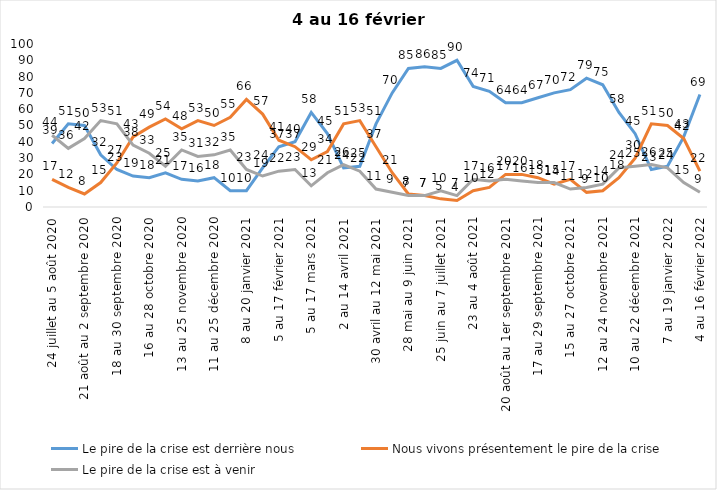
| Category | Le pire de la crise est derrière nous | Nous vivons présentement le pire de la crise | Le pire de la crise est à venir |
|---|---|---|---|
| 24 juillet au 5 août 2020 | 39 | 17 | 44 |
| 7 au 19 août 2020 | 51 | 12 | 36 |
| 21 août au 2 septembre 2020 | 50 | 8 | 42 |
| 4 au 16 septembre 2020 | 32 | 15 | 53 |
| 18 au 30 septembre 2020 | 23 | 27 | 51 |
| 2 au 14 octobre 2020 | 19 | 43 | 38 |
| 16 au 28 octobre 2020 | 18 | 49 | 33 |
| 30 octobre au 11 novembre 2020 | 21 | 54 | 25 |
| 13 au 25 novembre 2020 | 17 | 48 | 35 |
| 27 au 9 décembre 2020 | 16 | 53 | 31 |
| 11 au 25 décembre 2020 | 18 | 50 | 32 |
| 25 décembre 2020 au 6 janvier 2021 | 10 | 55 | 35 |
| 8 au 20 janvier 2021 | 10 | 66 | 23 |
| 22 janvier au 3 février 2021 | 24 | 57 | 19 |
| 5 au 17 février 2021 | 37 | 41 | 22 |
| 19 février au 3 mars 2021 | 40 | 37 | 23 |
| 5 au 17 mars 2021 | 58 | 29 | 13 |
| 19 au 31 mars 2021 | 45 | 34 | 21 |
| 2 au 14 avril 2021 | 24 | 51 | 26 |
| 16 au 28 avril 2021 | 25 | 53 | 22 |
| 30 avril au 12 mai 2021 | 51 | 37 | 11 |
| 14 au 26 mai 2021 | 70 | 21 | 9 |
| 28 mai au 9 juin 2021 | 85 | 8 | 7 |
| 11 au 23 juin 2021 | 86 | 7 | 7 |
| 25 juin au 7 juillet 2021 | 85 | 5 | 10 |
| 9 au 21 juillet 2021 | 90 | 4 | 7 |
| 23 au 4 août 2021 | 74 | 10 | 17 |
| 6 au 18 août 2021 | 71 | 12 | 16 |
| 20 août au 1er septembre 2021 | 64 | 20 | 17 |
| 3 au 15 septembre 2021 | 64 | 20 | 16 |
| 17 au 29 septembre 2021 | 67 | 18 | 15 |
| 1 au 13 octobre 2021 | 70 | 14 | 15 |
| 15 au 27 octobre 2021 | 72 | 17 | 11 |
| 29 octobre au 10 novembre 2021 | 79 | 9 | 12 |
| 12 au 24 novembre 2021 | 75 | 10 | 14 |
| 26 novembre au 8 décembre 2021 | 58 | 18 | 24 |
| 10 au 22 décembre 2021 | 45 | 30 | 25 |
| 24 décembre 2021 au 5 janvier 2022 2022 | 23 | 51 | 26 |
| 7 au 19 janvier 2022 | 25 | 50 | 24 |
| 21 janvier au 2 février 2022 | 43 | 42 | 15 |
| 4 au 16 février 2022 | 69 | 22 | 9 |